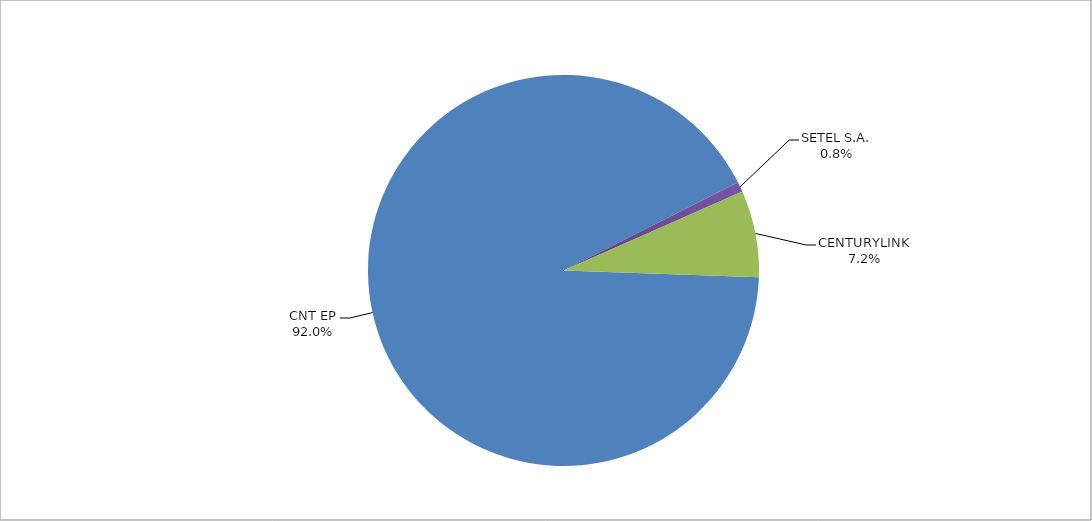
| Category | Series 0 |
|---|---|
| CNT EP | 333 |
| SETEL S.A. | 3 |
| CENTURYLINK | 26 |